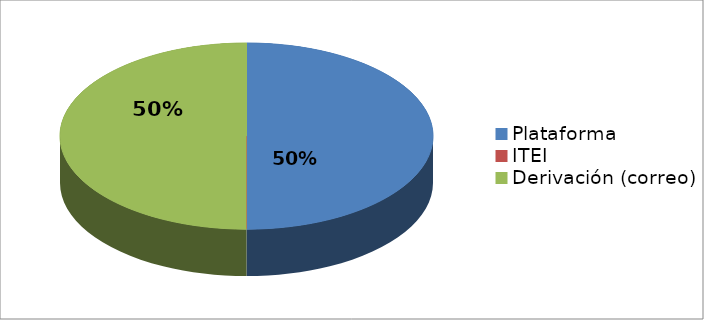
| Category | Series 0 | Series 1 |
|---|---|---|
| Plataforma | 3 | 0.5 |
| ITEI | 0 | 0 |
| Derivación (correo) | 3 | 0.5 |